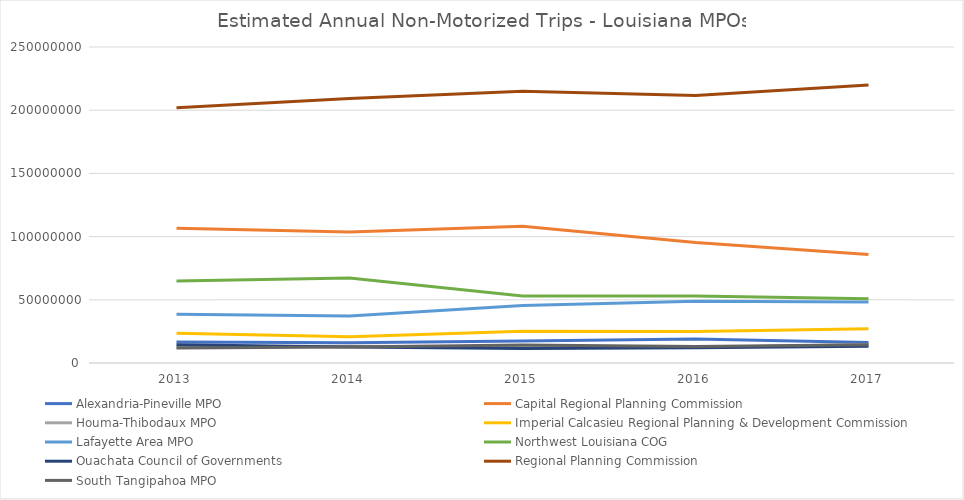
| Category | Alexandria-Pineville MPO | Capital Regional Planning Commission | Houma-Thibodaux MPO | Imperial Calcasieu Regional Planning & Development Commission | Lafayette Area MPO | Northwest Louisiana COG | Ouachata Council of Governments | Regional Planning Commission | South Tangipahoa MPO |
|---|---|---|---|---|---|---|---|---|---|
| 2013.0 | 16638054.825 | 106533407.79 | 12801119.169 | 23465583.017 | 38621244.718 | 64893106.822 | 14410118.872 | 201855979.034 | 11846264.163 |
| 2014.0 | 16010453.747 | 103655150.822 | 13254454.347 | 20683009.421 | 37245490.647 | 67332162.566 | 12699014.484 | 209249563.94 | 12580117.149 |
| 2015.0 | 17414308.201 | 108110965.6 | 12759282.138 | 25048181.44 | 45525674.224 | 53030708.626 | 11440449.853 | 214916907.821 | 14199557.924 |
| 2016.0 | 19079551.131 | 95278340.386 | 12256279.863 | 24969895.68 | 48896670.82 | 52926315.683 | 12089581.539 | 211708983.881 | 13030169.227 |
| 2017.0 | 16210819.227 | 85910744.94 | 14647883.504 | 27150942.434 | 48267575.686 | 50825266.195 | 13166233.794 | 220027559.445 | 14406838.205 |